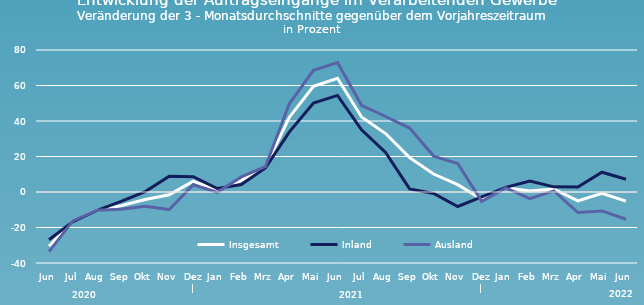
| Category | Insgesamt | Inland | Ausland |
|---|---|---|---|
| Jun | -30.566 | -26.934 | -33.608 |
| Jul | -16.392 | -16.658 | -16.148 |
| Aug | -10.292 | -10.361 | -10.23 |
| Sep | -7.665 | -5.322 | -9.777 |
| Okt | -4.234 | 0.236 | -8.014 |
| Nov | -1.563 | 8.872 | -9.919 |
| Dez | | 6.098 | 8.654 | 4.045 |
| Jan | 0.793 | 1.961 | -0.146 |
| Feb | 6.553 | 4.201 | 8.487 |
| Mrz | 13.961 | 13.594 | 14.276 |
| Apr | 42.143 | 33.865 | 49.86 |
| Mai | 59.56 | 50.064 | 68.524 |
| Jun | 64.054 | 54.421 | 72.934 |
| Jul | 42.257 | 34.999 | 48.852 |
| Aug | 32.928 | 22.311 | 42.536 |
| Sep | 19.343 | 1.731 | 36.012 |
| Okt | 10.143 | -0.804 | 20.229 |
| Nov | 4.133 | -8.159 | 16.03 |
| Dez | | -4.153 | -2.799 | -5.288 |
| Jan | 2.435 | 2.6 | 2.307 |
| Feb | 0.628 | 6.13 | -3.723 |
| Mrz | 1.684 | 2.894 | 0.622 |
| Apr | -5.039 | 2.765 | -11.559 |
| Mai | -0.696 | 11.13 | -10.655 |
| Jun | -5.18 | 7.193 | -15.37 |